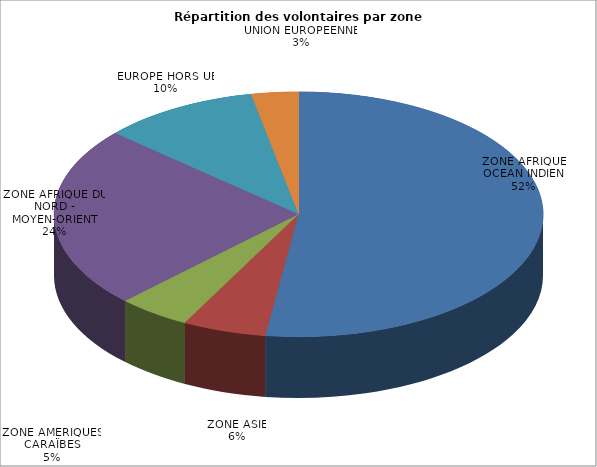
| Category | Nombre de volontaires | % |
|---|---|---|
| ZONE AFRIQUE - OCEAN INDIEN | 302 | 0.522 |
| ZONE ASIE | 32 | 0.055 |
| ZONE AMERIQUES - CARAÏBES | 28 | 0.048 |
| ZONE AFRIQUE DU NORD - MOYEN-ORIENT | 139 | 0.24 |
| EUROPE HORS UE | 60 | 0.104 |
| UNION EUROPEENNE | 18 | 0.031 |